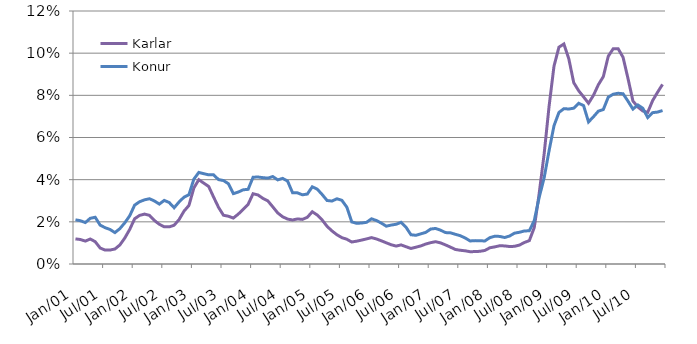
| Category | Karlar | Konur |
|---|---|---|
| 2001-01-01 | 1.191 | 2.096 |
| 2001-02-01 | 1.161 | 2.053 |
| 2001-03-01 | 1.087 | 1.966 |
| 2001-04-01 | 1.186 | 2.168 |
| 2001-05-01 | 1.059 | 2.216 |
| 2001-06-01 | 0.759 | 1.844 |
| 2001-07-01 | 0.661 | 1.723 |
| 2001-08-01 | 0.662 | 1.639 |
| 2001-09-01 | 0.712 | 1.489 |
| 2001-10-01 | 0.903 | 1.678 |
| 2001-11-01 | 1.232 | 1.955 |
| 2001-12-01 | 1.643 | 2.289 |
| 2002-01-01 | 2.147 | 2.794 |
| 2002-02-01 | 2.304 | 2.953 |
| 2002-03-01 | 2.368 | 3.044 |
| 2002-04-01 | 2.308 | 3.096 |
| 2002-05-01 | 2.063 | 2.99 |
| 2002-06-01 | 1.885 | 2.842 |
| 2002-07-01 | 1.762 | 3.017 |
| 2002-08-01 | 1.761 | 2.916 |
| 2002-09-01 | 1.839 | 2.668 |
| 2002-10-01 | 2.106 | 2.941 |
| 2002-11-01 | 2.507 | 3.171 |
| 2002-12-01 | 2.777 | 3.288 |
| 2003-01-01 | 3.607 | 4.027 |
| 2003-02-01 | 3.998 | 4.342 |
| 2003-03-01 | 3.837 | 4.284 |
| 2003-04-01 | 3.678 | 4.229 |
| 2003-05-01 | 3.174 | 4.228 |
| 2003-06-01 | 2.687 | 4.004 |
| 2003-07-01 | 2.312 | 3.958 |
| 2003-08-01 | 2.267 | 3.808 |
| 2003-09-01 | 2.178 | 3.337 |
| 2003-10-01 | 2.367 | 3.412 |
| 2003-11-01 | 2.591 | 3.519 |
| 2003-12-01 | 2.831 | 3.542 |
| 2004-01-01 | 3.333 | 4.115 |
| 2004-02-01 | 3.274 | 4.127 |
| 2004-03-01 | 3.112 | 4.094 |
| 2004-04-01 | 2.993 | 4.074 |
| 2004-05-01 | 2.71 | 4.148 |
| 2004-06-01 | 2.422 | 3.991 |
| 2004-07-01 | 2.239 | 4.06 |
| 2004-08-01 | 2.131 | 3.932 |
| 2004-09-01 | 2.087 | 3.383 |
| 2004-10-01 | 2.138 | 3.375 |
| 2004-11-01 | 2.116 | 3.282 |
| 2004-12-01 | 2.215 | 3.318 |
| 2005-01-01 | 2.479 | 3.662 |
| 2005-02-01 | 2.326 | 3.552 |
| 2005-03-01 | 2.09 | 3.297 |
| 2005-04-01 | 1.786 | 3.012 |
| 2005-05-01 | 1.568 | 2.986 |
| 2005-06-01 | 1.387 | 3.093 |
| 2005-07-01 | 1.25 | 3.021 |
| 2005-08-01 | 1.174 | 2.698 |
| 2005-09-01 | 1.043 | 1.996 |
| 2005-10-01 | 1.083 | 1.93 |
| 2005-11-01 | 1.134 | 1.944 |
| 2005-12-01 | 1.19 | 1.976 |
| 2006-01-01 | 1.251 | 2.144 |
| 2006-02-01 | 1.189 | 2.064 |
| 2006-03-01 | 1.101 | 1.94 |
| 2006-04-01 | 1.005 | 1.794 |
| 2006-05-01 | 0.913 | 1.847 |
| 2006-06-01 | 0.85 | 1.885 |
| 2006-07-01 | 0.906 | 1.977 |
| 2006-08-01 | 0.821 | 1.744 |
| 2006-09-01 | 0.736 | 1.388 |
| 2006-10-01 | 0.796 | 1.361 |
| 2006-11-01 | 0.858 | 1.43 |
| 2006-12-01 | 0.948 | 1.5 |
| 2007-01-01 | 1.012 | 1.658 |
| 2007-02-01 | 1.058 | 1.686 |
| 2007-03-01 | 1.002 | 1.605 |
| 2007-04-01 | 0.906 | 1.49 |
| 2007-05-01 | 0.801 | 1.48 |
| 2007-06-01 | 0.691 | 1.409 |
| 2007-07-01 | 0.652 | 1.342 |
| 2007-08-01 | 0.625 | 1.233 |
| 2007-09-01 | 0.583 | 1.092 |
| 2007-10-01 | 0.59 | 1.109 |
| 2007-11-01 | 0.602 | 1.1 |
| 2007-12-01 | 0.644 | 1.094 |
| 2008-01-01 | 0.77 | 1.249 |
| 2008-02-01 | 0.813 | 1.319 |
| 2008-03-01 | 0.866 | 1.308 |
| 2008-04-01 | 0.857 | 1.256 |
| 2008-05-01 | 0.829 | 1.328 |
| 2008-06-01 | 0.838 | 1.464 |
| 2008-07-01 | 0.898 | 1.505 |
| 2008-08-01 | 1.021 | 1.568 |
| 2008-09-01 | 1.109 | 1.574 |
| 2008-10-01 | 1.73 | 2.063 |
| 2008-11-01 | 3.351 | 3.164 |
| 2008-12-01 | 5.22 | 4.083 |
| 2009-01-01 | 7.476 | 5.368 |
| 2009-02-01 | 9.386 | 6.559 |
| 2009-03-01 | 10.284 | 7.187 |
| 2009-04-01 | 10.436 | 7.368 |
| 2009-05-01 | 9.735 | 7.351 |
| 2009-06-01 | 8.601 | 7.391 |
| 2009-07-01 | 8.218 | 7.624 |
| 2009-08-01 | 7.926 | 7.512 |
| 2009-09-01 | 7.623 | 6.738 |
| 2009-10-01 | 8 | 6.983 |
| 2009-11-01 | 8.506 | 7.251 |
| 2009-12-01 | 8.888 | 7.329 |
| 2010-01-01 | 9.854 | 7.913 |
| 2010-02-01 | 10.21 | 8.054 |
| 2010-03-01 | 10.212 | 8.098 |
| 2010-04-01 | 9.802 | 8.075 |
| 2010-05-01 | 8.797 | 7.722 |
| 2010-06-01 | 7.731 | 7.348 |
| 2010-07-01 | 7.447 | 7.543 |
| 2010-08-01 | 7.258 | 7.385 |
| 2010-09-01 | 7.196 | 6.948 |
| 2010-10-01 | 7.752 | 7.179 |
| 2010-11-01 | 8.149 | 7.206 |
| 2010-12-01 | 8.519 | 7.279 |